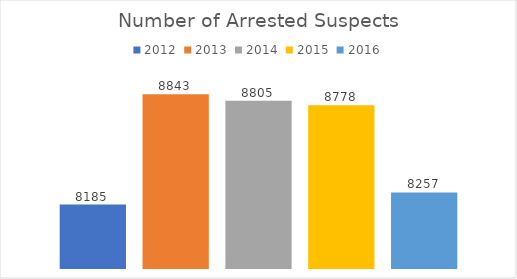
| Category | 2012 | 2013 | 2014 | 2015 | 2016 |
|---|---|---|---|---|---|
| 0 | 8185 | 8843 | 8805 | 8778 | 8257 |